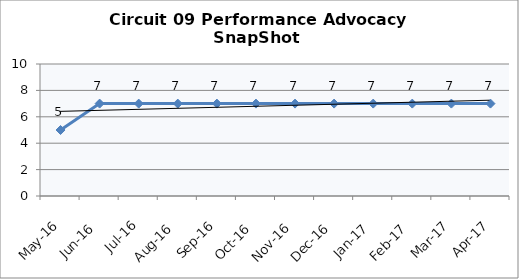
| Category | Circuit 09 |
|---|---|
| May-16 | 5 |
| Jun-16 | 7 |
| Jul-16 | 7 |
| Aug-16 | 7 |
| Sep-16 | 7 |
| Oct-16 | 7 |
| Nov-16 | 7 |
| Dec-16 | 7 |
| Jan-17 | 7 |
| Feb-17 | 7 |
| Mar-17 | 7 |
| Apr-17 | 7 |